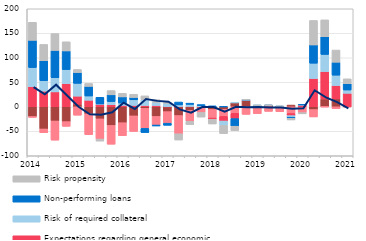
| Category | Costs of funding | Competition from other banks | Expectations regarding general economic situation | Risk of required collateral  | Non-performing loans  | Risk propensity |
|---|---|---|---|---|---|---|
| 2014.0 | -19.9 | -1.7 | 41 | 39.1 | 55.5 | 36.9 |
| nan | -45.3 | -7.7 | 31.9 | 21.4 | 40.8 | 33.2 |
| nan | -29 | -39.1 | 30.4 | 28.9 | 55.7 | 34.4 |
| nan | -30.3 | -9.6 | 47.3 | 28.6 | 38.1 | 18.7 |
| 2015.0 | 5.3 | -17.2 | 16.4 | 26.1 | 22.1 | 6.2 |
| nan | -14.5 | -42.3 | 13.3 | 8.7 | 19.6 | 6 |
| nan | -24.7 | -41.2 | 5.2 | 0.6 | 13.5 | -4.1 |
| nan | -38.1 | -38.3 | 4.2 | 6.5 | 13.7 | 8.7 |
| 2016.0 | -32.5 | -26.6 | 2.8 | 4.8 | 12.6 | 7.3 |
| nan | -18.6 | -31.7 | 2.8 | 11.4 | 4.8 | 6.6 |
| nan | -3.2 | -40.9 | 2.6 | 11.7 | -8.5 | 8 |
| nan | -19.7 | -17.5 | 2.6 | 6.4 | -2 | 5.6 |
| 2017.0 | -9.9 | -23.6 | 0.3 | 6.6 | -4.3 | 1.9 |
| nan | -17.9 | -37.2 | 0.4 | 3.4 | 5.9 | -12.7 |
| nan | -7.4 | -22.4 | 0.6 | 4.3 | 2.5 | -6.8 |
| nan | -2.2 | -9.3 | 0.1 | 2.2 | 2.2 | -9.5 |
| 2018.0 | -5.5 | -17.5 | -2.5 | 0 | 1.9 | -9.6 |
| nan | -5.2 | -14.4 | -9.5 | -9.1 | 0.3 | -16.5 |
| nan | 8.2 | -13.3 | -10.8 | 0.3 | -15.6 | -8.9 |
| nan | 13.5 | -15.5 | 0.1 | 0.3 | 0.3 | 0.1 |
| 2019.0 | 0 | -14 | 0.1 | 2.4 | 0.3 | 0.1 |
| nan | 2.3 | -9.4 | 0.1 | 0.3 | 0.3 | 0.1 |
| nan | 0 | -9.9 | 0.1 | 0.4 | 0.4 | 0.1 |
| nan | 3.5 | -13.7 | -4.4 | -3.2 | -2.2 | -3.4 |
| 2020.0 | 0 | -11.883 | 3.724 | 0.378 | 0.378 | -2.584 |
| nan | -5.65 | -15.101 | 57.663 | 31.218 | 37.319 | 50.006 |
| nan | 15.928 | -0.146 | 55.94 | 34.956 | 36.078 | 34.536 |
| nan | 16.17 | -3.996 | 27.215 | 21.105 | 26.435 | 24.908 |
| 2021.0 | 0 | -0.156 | 27.49 | 6.714 | 12.868 | 10.026 |